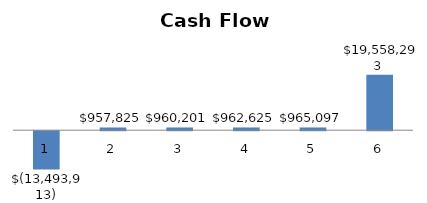
| Category | Series 0 |
|---|---|
| 0 | -13493912.966 |
| 1 | 957825 |
| 2 | 960201 |
| 3 | 962624.52 |
| 4 | 965096.51 |
| 5 | 19558293.146 |